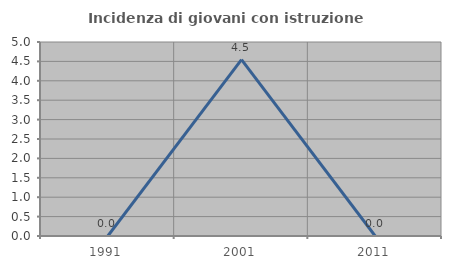
| Category | Incidenza di giovani con istruzione universitaria |
|---|---|
| 1991.0 | 0 |
| 2001.0 | 4.545 |
| 2011.0 | 0 |